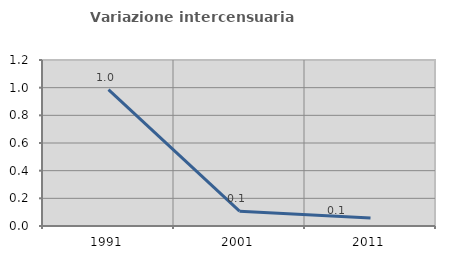
| Category | Variazione intercensuaria annua |
|---|---|
| 1991.0 | 0.986 |
| 2001.0 | 0.107 |
| 2011.0 | 0.058 |